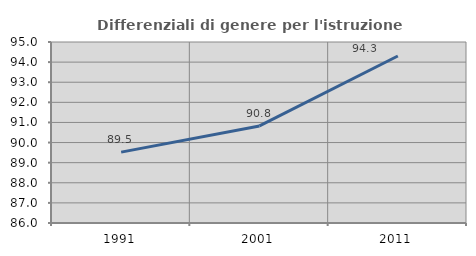
| Category | Differenziali di genere per l'istruzione superiore |
|---|---|
| 1991.0 | 89.523 |
| 2001.0 | 90.826 |
| 2011.0 | 94.304 |